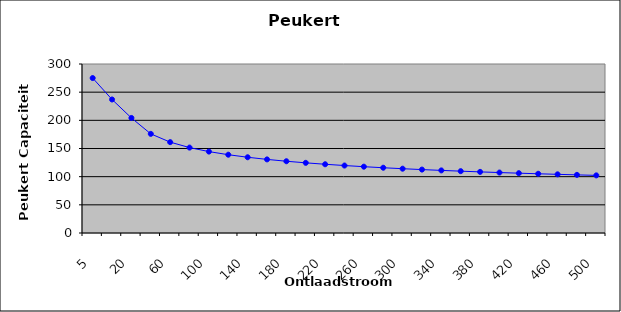
| Category | Series 1 |
|---|---|
| 5.0 | 275.059 |
| 10.0 | 237.009 |
| 20.0 | 204.223 |
| 40.0 | 175.972 |
| 60.0 | 161.295 |
| 80.0 | 151.629 |
| 100.0 | 144.533 |
| 120.0 | 138.982 |
| 140.0 | 134.456 |
| 160.0 | 130.654 |
| 180.0 | 127.39 |
| 200.0 | 124.539 |
| 220.0 | 122.015 |
| 240.0 | 119.756 |
| 260.0 | 117.715 |
| 280.0 | 115.856 |
| 300.0 | 114.152 |
| 320.0 | 112.58 |
| 340.0 | 111.123 |
| 360.0 | 109.767 |
| 380.0 | 108.5 |
| 400.0 | 107.311 |
| 420.0 | 106.192 |
| 440.0 | 105.137 |
| 460.0 | 104.137 |
| 480.0 | 103.19 |
| 500.0 | 102.289 |